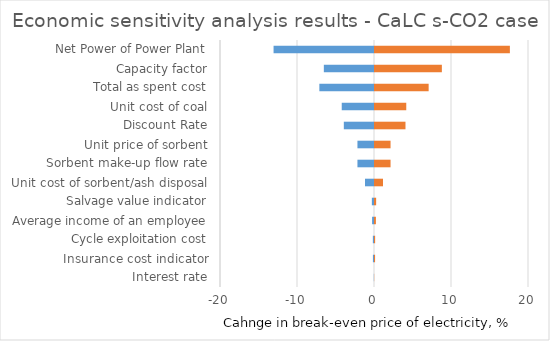
| Category | Series 0 | Series 1 |
|---|---|---|
| Interest rate | -0.023 | 0.022 |
| Insurance cost indicator | -0.141 | 0.141 |
| Cycle exploitation cost | -0.148 | 0.148 |
| Average income of an employee | -0.246 | 0.246 |
| Salvage value indicator | -0.279 | 0.279 |
| Unit cost of sorbent/ash disposal | -1.168 | 1.168 |
| Sorbent make-up flow rate | -2.15 | 2.15 |
| Unit price of sorbent | -2.15 | 2.15 |
| Discount Rate | -3.92 | 4.089 |
| Unit cost of coal | -4.19 | 4.19 |
| Total as spent cost | -7.097 | 7.097 |
| Capacity factor | -6.515 | 8.814 |
| Net Power of Power Plant | -13.043 | 17.647 |